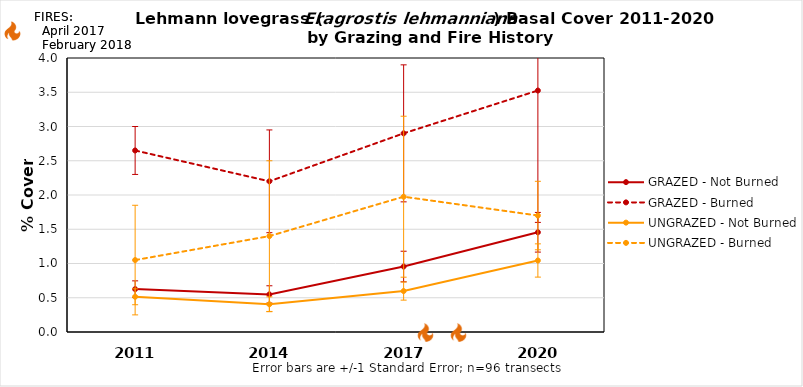
| Category | GRAZED - Not Burned | GRAZED - Burned | UNGRAZED - Not Burned | UNGRAZED - Burned |
|---|---|---|---|---|
| 2011.0 | 0.626 | 2.65 | 0.514 | 1.05 |
| 2014.0 | 0.549 | 2.2 | 0.405 | 1.4 |
| 2017.0 | 0.956 | 2.9 | 0.598 | 1.975 |
| 2020.0 | 1.456 | 3.525 | 1.044 | 1.7 |